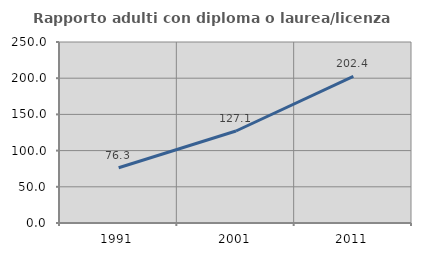
| Category | Rapporto adulti con diploma o laurea/licenza media  |
|---|---|
| 1991.0 | 76.325 |
| 2001.0 | 127.057 |
| 2011.0 | 202.413 |